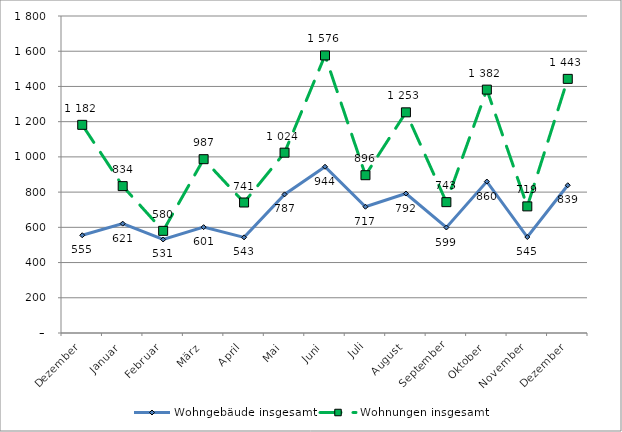
| Category | Wohngebäude insgesamt | Wohnungen insgesamt |
|---|---|---|
| Dezember | 555 | 1182 |
| Januar | 621 | 834 |
| Februar | 531 | 580 |
| März | 601 | 987 |
| April | 543 | 741 |
| Mai | 787 | 1024 |
| Juni | 944 | 1576 |
| Juli | 717 | 896 |
| August | 792 | 1253 |
| September | 599 | 743 |
| Oktober | 860 | 1382 |
| November | 545 | 719 |
| Dezember | 839 | 1443 |